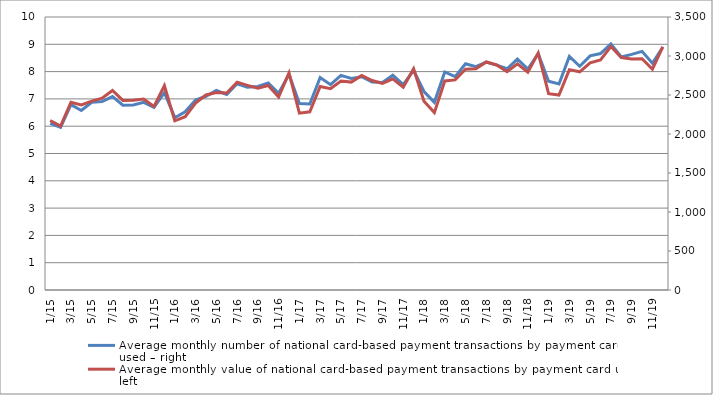
| Category | Average monthly number of national card-based payment transactions by payment card used – right |
|---|---|
| 2015-01-01 | 6.104 |
| 2015-02-01 | 5.958 |
| 2015-03-01 | 6.788 |
| 2015-04-01 | 6.574 |
| 2015-05-01 | 6.876 |
| 2015-06-01 | 6.9 |
| 2015-07-01 | 7.085 |
| 2015-08-01 | 6.769 |
| 2015-09-01 | 6.778 |
| 2015-10-01 | 6.872 |
| 2015-11-01 | 6.689 |
| 2015-12-01 | 7.232 |
| 2016-01-01 | 6.312 |
| 2016-02-01 | 6.53 |
| 2016-03-01 | 6.962 |
| 2016-04-01 | 7.096 |
| 2016-05-01 | 7.307 |
| 2016-06-01 | 7.161 |
| 2016-07-01 | 7.554 |
| 2016-08-01 | 7.425 |
| 2016-09-01 | 7.454 |
| 2016-10-01 | 7.583 |
| 2016-11-01 | 7.206 |
| 2016-12-01 | 7.898 |
| 2017-01-01 | 6.83 |
| 2017-02-01 | 6.812 |
| 2017-03-01 | 7.784 |
| 2017-04-01 | 7.52 |
| 2017-05-01 | 7.863 |
| 2017-06-01 | 7.746 |
| 2017-07-01 | 7.813 |
| 2017-08-01 | 7.618 |
| 2017-09-01 | 7.6 |
| 2017-10-01 | 7.866 |
| 2017-11-01 | 7.52 |
| 2017-12-01 | 8.044 |
| 2018-01-01 | 7.27 |
| 2018-02-01 | 6.875 |
| 2018-03-01 | 7.986 |
| 2018-04-01 | 7.816 |
| 2018-05-01 | 8.289 |
| 2018-06-01 | 8.183 |
| 2018-07-01 | 8.35 |
| 2018-08-01 | 8.239 |
| 2018-09-01 | 8.104 |
| 2018-10-01 | 8.459 |
| 2018-11-01 | 8.096 |
| 2018-12-01 | 8.656 |
| 2019-01-01 | 7.648 |
| 2019-02-01 | 7.548 |
| 2019-03-01 | 8.554 |
| 2019-04-01 | 8.197 |
| 2019-05-01 | 8.576 |
| 2019-06-01 | 8.661 |
| 2019-07-01 | 9.012 |
| 2019-08-01 | 8.536 |
| 2019-09-01 | 8.63 |
| 2019-10-01 | 8.741 |
| 2019-11-01 | 8.304 |
| 2019-12-01 | 8.901 |